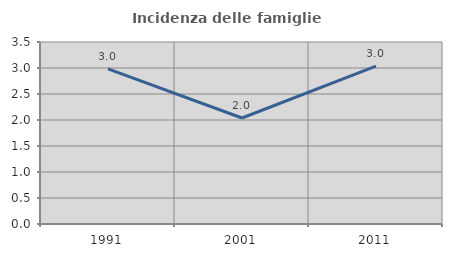
| Category | Incidenza delle famiglie numerose |
|---|---|
| 1991.0 | 2.985 |
| 2001.0 | 2.038 |
| 2011.0 | 3.036 |